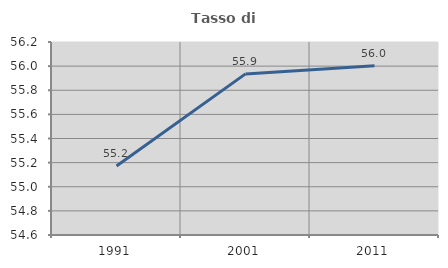
| Category | Tasso di occupazione   |
|---|---|
| 1991.0 | 55.172 |
| 2001.0 | 55.936 |
| 2011.0 | 56.002 |